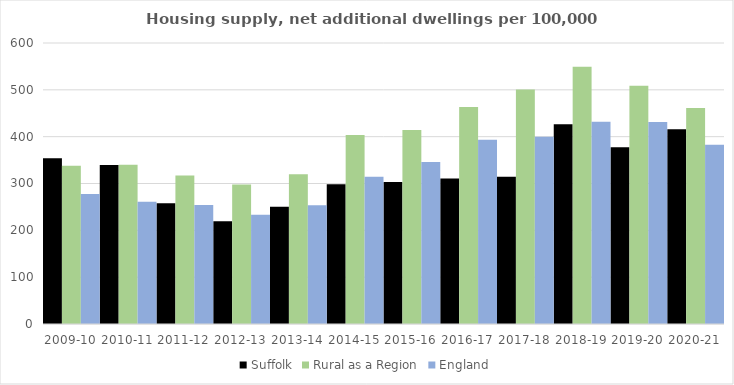
| Category | Suffolk | Rural as a Region | England |
|---|---|---|---|
| 2009-10 | 353.649 | 337.852 | 277.548 |
| 2010-11 | 339.564 | 340.105 | 260.994 |
| 2011-12 | 257.784 | 317.04 | 254.007 |
| 2012-13 | 219.568 | 297.763 | 233.153 |
| 2013-14 | 250.325 | 319.835 | 253.602 |
| 2014-15 | 298.586 | 403.796 | 314.256 |
| 2015-16 | 303.316 | 414.091 | 346.154 |
| 2016-17 | 310.846 | 463.209 | 393.256 |
| 2017-18 | 314.54 | 500.68 | 399.646 |
| 2018-19 | 426.732 | 549.491 | 432.099 |
| 2019-20 | 377.225 | 508.493 | 431.187 |
| 2020-21 | 416.028 | 461.114 | 382.827 |